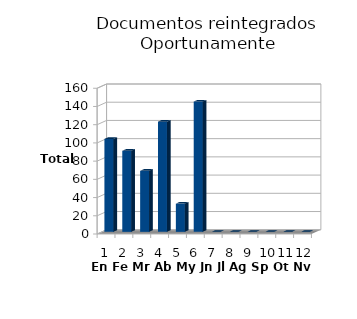
| Category | Series 0 |
|---|---|
| 0 | 102 |
| 1 | 89 |
| 2 | 67 |
| 3 | 121 |
| 4 | 31 |
| 5 | 143 |
| 6 | 0 |
| 7 | 0 |
| 8 | 0 |
| 9 | 0 |
| 10 | 0 |
| 11 | 0 |